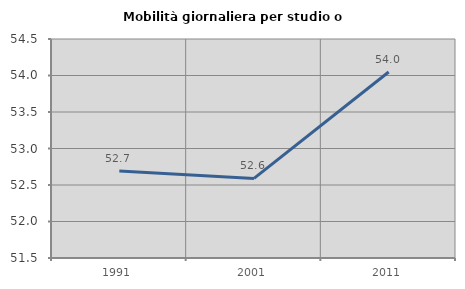
| Category | Mobilità giornaliera per studio o lavoro |
|---|---|
| 1991.0 | 52.691 |
| 2001.0 | 52.591 |
| 2011.0 | 54.049 |